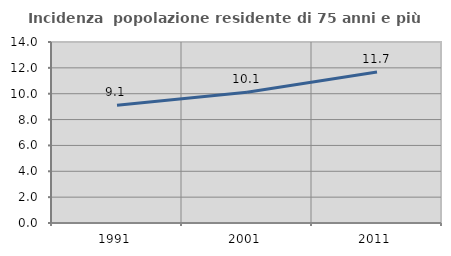
| Category | Incidenza  popolazione residente di 75 anni e più |
|---|---|
| 1991.0 | 9.099 |
| 2001.0 | 10.119 |
| 2011.0 | 11.673 |